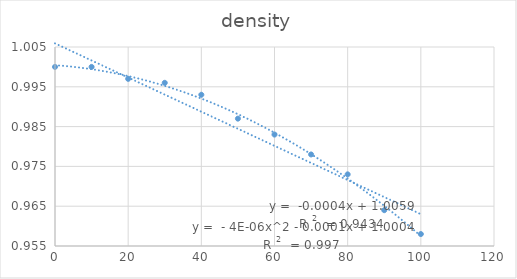
| Category | density |
|---|---|
| 0.0 | 1 |
| 10.0 | 1 |
| 20.0 | 0.997 |
| 30.0 | 0.996 |
| 40.0 | 0.993 |
| 50.0 | 0.987 |
| 60.0 | 0.983 |
| 70.0 | 0.978 |
| 80.0 | 0.973 |
| 90.0 | 0.964 |
| 100.0 | 0.958 |